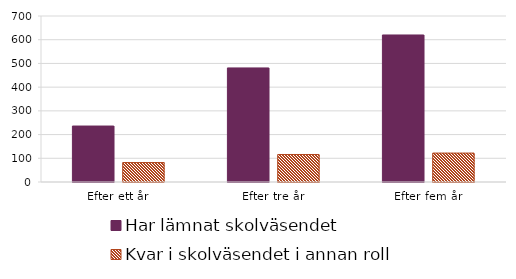
| Category | Har lämnat skolväsendet | Kvar i skolväsendet i annan roll |
|---|---|---|
| Efter ett år | 236 | 82 |
| Efter tre år | 481 | 116 |
| Efter fem år | 620 | 122 |